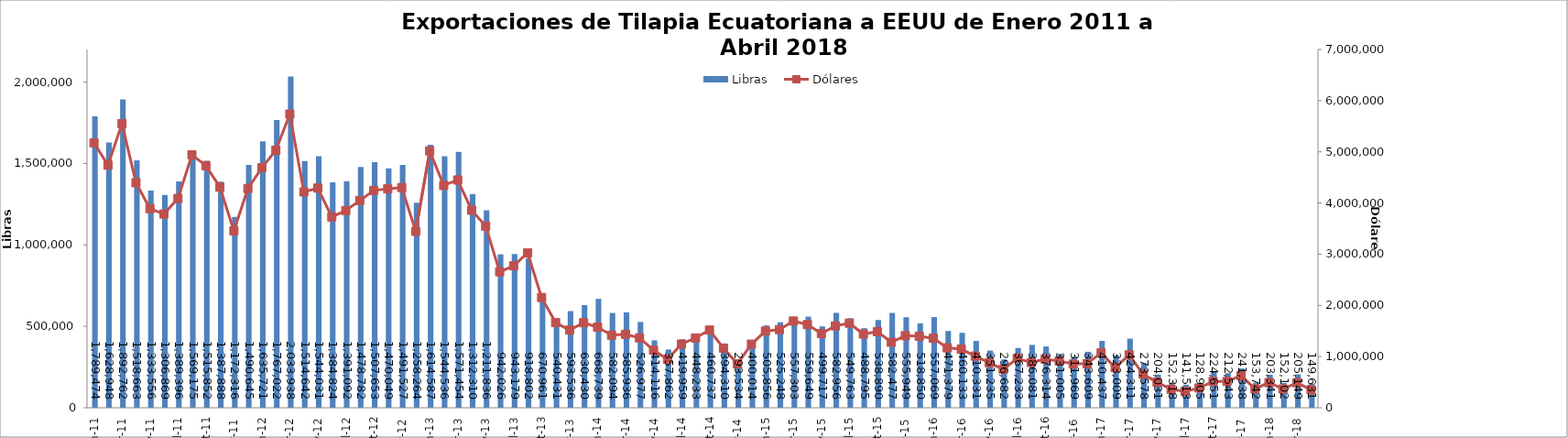
| Category | Libras  |
|---|---|
| 2011-01-01 | 1789473.82 |
| 2011-02-01 | 1628948.076 |
| 2011-03-01 | 1892761.535 |
| 2011-04-01 | 1518662.961 |
| 2011-05-01 | 1333555.926 |
| 2011-06-01 | 1306869.243 |
| 2011-07-01 | 1389396.24 |
| 2011-08-01 | 1569174.756 |
| 2011-09-01 | 1515852.096 |
| 2011-10-01 | 1387888.293 |
| 2011-11-01 | 1172315.891 |
| 2011-12-01 | 1490644.699 |
| 2012-01-01 | 1635720.607 |
| 2012-02-01 | 1767022.174 |
| 2012-03-01 | 2033937.505 |
| 2012-04-01 | 1514641.77 |
| 2012-05-01 | 1544031.293 |
| 2012-06-01 | 1384823.899 |
| 2012-07-01 | 1391091.577 |
| 2012-08-01 | 1478781.747 |
| 2012-09-01 | 1507653.188 |
| 2012-10-01 | 1470049.326 |
| 2012-11-01 | 1491526.539 |
| 2012-12-01 | 1258264 |
| 2013-01-01 | 1614587 |
| 2013-02-01 | 1544536.146 |
| 2013-03-01 | 1571454.312 |
| 2013-04-01 | 1312310.196 |
| 2013-05-01 | 1211835.551 |
| 2013-06-01 | 942025.58 |
| 2013-07-01 | 943178.586 |
| 2013-08-01 | 918802.324 |
| 2013-09-01 | 670961.192 |
| 2013-10-01 | 540431.235 |
| 2013-11-01 | 593535.64 |
| 2013-12-01 | 630429.621 |
| 2014-01-01 | 668739 |
| 2014-02-01 | 582093.766 |
| 2014-03-01 | 585936.383 |
| 2014-04-01 | 526976.561 |
| 2014-05-01 | 414116.473 |
| 2014-06-01 | 357861.695 |
| 2014-07-01 | 419958.663 |
| 2014-08-01 | 448233 |
| 2014-09-01 | 460737.149 |
| 2014-10-01 | 394310.347 |
| 2014-11-01 | 293533.672 |
| 2014-12-01 | 400013.647 |
| 2015-01-01 | 505856.493 |
| 2015-02-01 | 525248 |
| 2015-03-01 | 557303.039 |
| 2015-04-01 | 559648.733 |
| 2015-05-01 | 499716.682 |
| 2015-06-01 | 582955.764 |
| 2015-07-01 | 549763.307 |
| 2015-08-01 | 488795.094 |
| 2015-09-01 | 538890.219 |
| 2015-10-01 | 582477.366 |
| 2015-11-01 | 555949.414 |
| 2015-12-01 | 518850.405 |
| 2016-01-01 | 557069.351 |
| 2016-02-01 | 471378.754 |
| 2016-03-01 | 460133.089 |
| 2016-04-01 | 410331.175 |
| 2016-05-01 | 351235 |
| 2016-06-01 | 296682 |
| 2016-07-01 | 367233.45 |
| 2016-08-01 | 386080.575 |
| 2016-09-01 | 376314.197 |
| 2016-10-01 | 331005.258 |
| 2016-11-01 | 311968.537 |
| 2016-12-01 | 343608.956 |
| 2017-01-01 | 410436.996 |
| 2017-02-01 | 323009.174 |
| 2017-03-01 | 424310.544 |
| 2017-04-01 | 273577.632 |
| 2017-05-01 | 204031.321 |
| 2017-06-01 | 152318.019 |
| 2017-07-01 | 141513.274 |
| 2017-08-01 | 128905.167 |
| 2017-09-01 | 224650.945 |
| 2017-10-01 | 212543.281 |
| 2017-11-01 | 241337.562 |
| 2017-12-01 | 153742.19 |
| 2018-01-01 | 203341.281 |
| 2018-02-01 | 152101.968 |
| 2018-03-01 | 205149.053 |
| 2018-04-01 | 149630.611 |